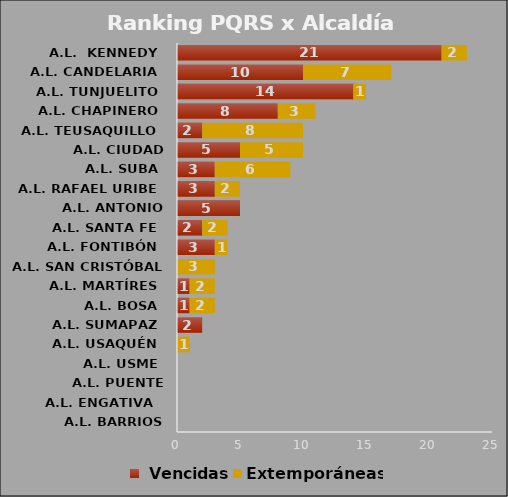
| Category |  Vencidas | Extemporáneas |
|---|---|---|
| A.L. BARRIOS UNIDOS | 0 | 0 |
| A.L. ENGATIVA  | 0 | 0 |
| A.L. PUENTE ARANDA | 0 | 0 |
| A.L. USME | 0 | 0 |
| A.L. USAQUÉN | 0 | 1 |
| A.L. SUMAPAZ | 2 | 0 |
| A.L. BOSA | 1 | 2 |
| A.L. MARTÍRES | 1 | 2 |
| A.L. SAN CRISTÓBAL | 0 | 3 |
| A.L. FONTIBÓN | 3 | 1 |
| A.L. SANTA FE | 2 | 2 |
| A.L. ANTONIO NARINO | 5 | 0 |
| A.L. RAFAEL URIBE | 3 | 2 |
| A.L. SUBA | 3 | 6 |
| A.L. CIUDAD BOLÍVAR | 5 | 5 |
| A.L. TEUSAQUILLO | 2 | 8 |
| A.L. CHAPINERO | 8 | 3 |
| A.L. TUNJUELITO | 14 | 1 |
| A.L. CANDELARIA | 10 | 7 |
| A.L.  KENNEDY | 21 | 2 |